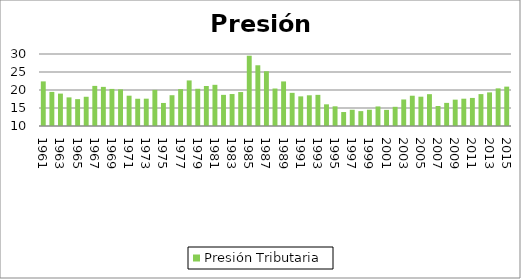
| Category | Presión Tributaria |
|---|---|
| 1961.0 | 22.39 |
| 1962.0 | 19.47 |
| 1963.0 | 19 |
| 1964.0 | 17.95 |
| 1965.0 | 17.46 |
| 1966.0 | 18.12 |
| 1967.0 | 21.14 |
| 1968.0 | 20.87 |
| 1969.0 | 20.3 |
| 1970.0 | 20.18 |
| 1971.0 | 18.42 |
| 1972.0 | 17.57 |
| 1973.0 | 17.59 |
| 1974.0 | 20.03 |
| 1975.0 | 16.4 |
| 1976.0 | 18.55 |
| 1977.0 | 20.25 |
| 1978.0 | 22.66 |
| 1979.0 | 20.34 |
| 1980.0 | 21.11 |
| 1981.0 | 21.44 |
| 1982.0 | 18.65 |
| 1983.0 | 18.88 |
| 1984.0 | 19.43 |
| 1985.0 | 29.52 |
| 1986.0 | 26.87 |
| 1987.0 | 25.21 |
| 1988.0 | 20.41 |
| 1989.0 | 22.38 |
| 1990.0 | 19.21 |
| 1991.0 | 18.23 |
| 1992.0 | 18.53 |
| 1993.0 | 18.65 |
| 1994.0 | 16.02 |
| 1995.0 | 15.47 |
| 1996.0 | 13.88 |
| 1997.0 | 14.51 |
| 1998.0 | 14.13 |
| 1999.0 | 14.52 |
| 2000.0 | 15.43 |
| 2001.0 | 14.48 |
| 2002.0 | 15.33 |
| 2003.0 | 17.37 |
| 2004.0 | 18.41 |
| 2005.0 | 18.14 |
| 2006.0 | 18.84 |
| 2007.0 | 15.555 |
| 2008.0 | 16.423 |
| 2009.0 | 17.319 |
| 2010.0 | 17.581 |
| 2011.0 | 17.796 |
| 2012.0 | 18.862 |
| 2013.0 | 19.337 |
| 2014.0 | 20.453 |
| 2015.0 | 20.937 |